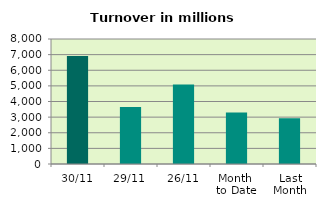
| Category | Series 0 |
|---|---|
| 30/11 | 6909.705 |
| 29/11 | 3654.429 |
| 26/11 | 5084.083 |
| Month 
to Date | 3292.145 |
| Last
Month | 2924.951 |